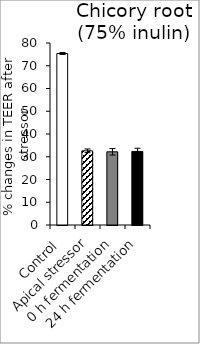
| Category | average |
|---|---|
| Control | 75.393 |
| Apical stressor | 32.601 |
| 0 h fermentation | 32.168 |
| 24 h fermentation | 32.336 |